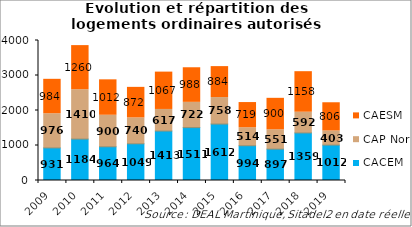
| Category | CACEM | CAP Nord | CAESM |
|---|---|---|---|
| 2009 | 931 | 976 | 984 |
| 2010 | 1184 | 1410 | 1260 |
| 2011 | 964 | 900 | 1012 |
| 2012 | 1049 | 740 | 872 |
| 2013 | 1413 | 617 | 1067 |
| 2014 | 1511 | 722 | 988 |
| 2015 | 1612 | 758 | 884 |
| 2016 | 994 | 514 | 719 |
| 2017 | 897 | 551 | 900 |
| 2018 | 1359 | 592 | 1158 |
| 2019 | 1012 | 403 | 806 |